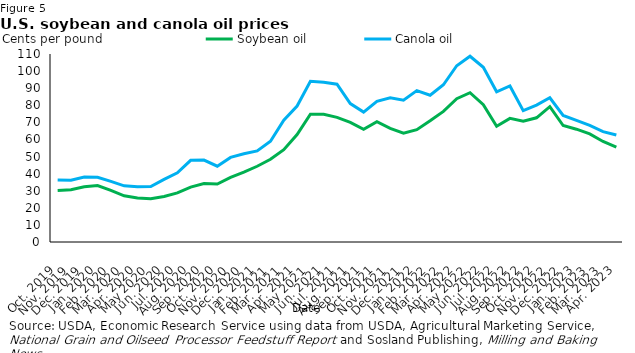
| Category | Soybean oil | Canola oil |
|---|---|---|
| Oct. 2019 | 30.14 | 36.312 |
| Nov. 2019 | 30.62 | 36.15 |
| Dec. 2019 | 32.27 | 38.062 |
| Jan. 2020 | 33.04 | 37.9 |
| Feb. 2020 | 30.26 | 35.5 |
| Mar. 2020 | 27.04 | 32.875 |
| Apr. 2020 | 25.69 | 32.375 |
| May 2020 | 25.27 | 32.4 |
| Jun. 2020 | 26.61 | 36.625 |
| Jul. 2020 | 28.71 | 40.5 |
| Aug. 2020 | 32.13 | 47.812 |
| Sep. 2020 | 34.2 | 47.938 |
| Oct. 2020 | 33.91 | 44.35 |
| Nov. 2020 | 37.79 | 49.5 |
| Dec. 2020 | 40.85 | 51.65 |
| Jan. 2021 | 44.31 | 53.312 |
| Feb. 2021 | 48.37 | 58.938 |
| Mar. 2021 | 54 | 71.312 |
| Apr. 2021 | 62.88 | 79.55 |
| May 2021 | 74.75 | 94.062 |
| Jun. 2021 | 74.75 | 93.5 |
| Jul. 2021 | 72.93 | 92.3 |
| Aug. 2021 | 70.01 | 81 |
| Sep. 2021 | 65.93 | 76 |
| Oct. 2021 | 70.42 | 82.3 |
| Nov. 2021 | 66.46 | 84.375 |
| Dec. 2021 | 63.69 | 82.95 |
| Jan. 2022 | 65.7 | 88.562 |
| Feb. 2022 | 70.91 | 85.875 |
| Mar. 2022 | 76.405 | 92 |
| Apr. 2022 | 83.846 | 103.15 |
| May 2022 | 87.385 | 108.688 |
| Jun. 2022 | 80.298 | 102.25 |
| Jul. 2022 | 67.748 | 87.9 |
| Aug. 2022 | 72.335 | 91.312 |
| Sep. 2022 | 70.626 | 76.85 |
| Oct. 2022 | 72.67 | 80.125 |
| Nov. 2022 | 79.18 | 84.375 |
| Dec. 2022 | 68.14 | 74.05 |
| Jan. 2023 | 66 | 71.188 |
| Feb. 2023 | 63.243 | 68.25 |
| Mar. 2023 | 58.83 | 64.6 |
| Apr. 2023 | 55.475 | 62.625 |